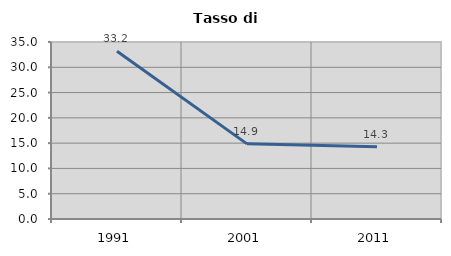
| Category | Tasso di disoccupazione   |
|---|---|
| 1991.0 | 33.188 |
| 2001.0 | 14.858 |
| 2011.0 | 14.264 |